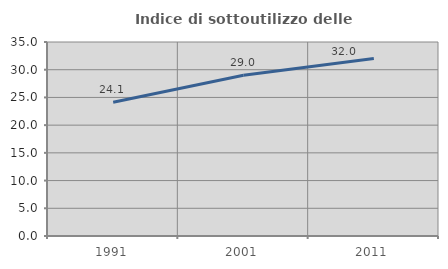
| Category | Indice di sottoutilizzo delle abitazioni  |
|---|---|
| 1991.0 | 24.138 |
| 2001.0 | 28.988 |
| 2011.0 | 32.04 |